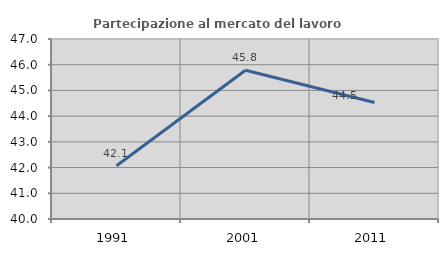
| Category | Partecipazione al mercato del lavoro  femminile |
|---|---|
| 1991.0 | 42.074 |
| 2001.0 | 45.786 |
| 2011.0 | 44.533 |